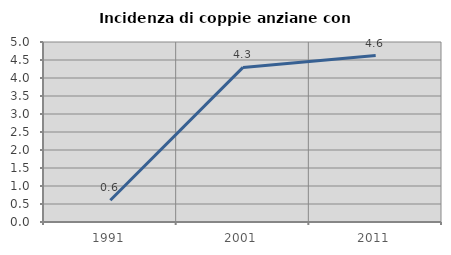
| Category | Incidenza di coppie anziane con figli |
|---|---|
| 1991.0 | 0.602 |
| 2001.0 | 4.294 |
| 2011.0 | 4.624 |